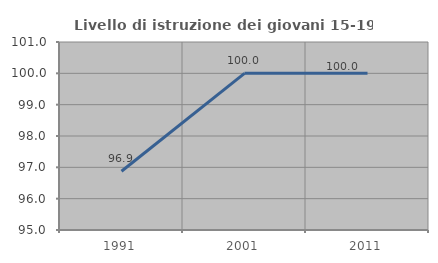
| Category | Livello di istruzione dei giovani 15-19 anni |
|---|---|
| 1991.0 | 96.875 |
| 2001.0 | 100 |
| 2011.0 | 100 |